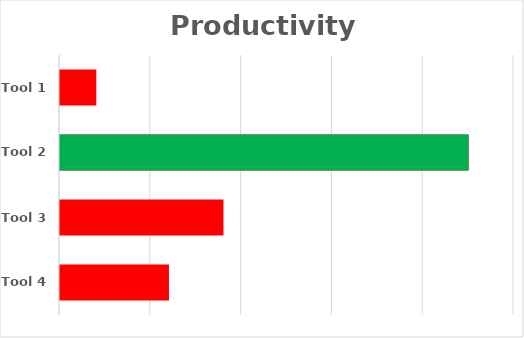
| Category | Series 0 | Max |
|---|---|---|
| Tool 1 | 40 | 0 |
| Tool 2 | 450 | 450 |
| Tool 3 | 180 | 0 |
| Tool 4 | 120 | 0 |